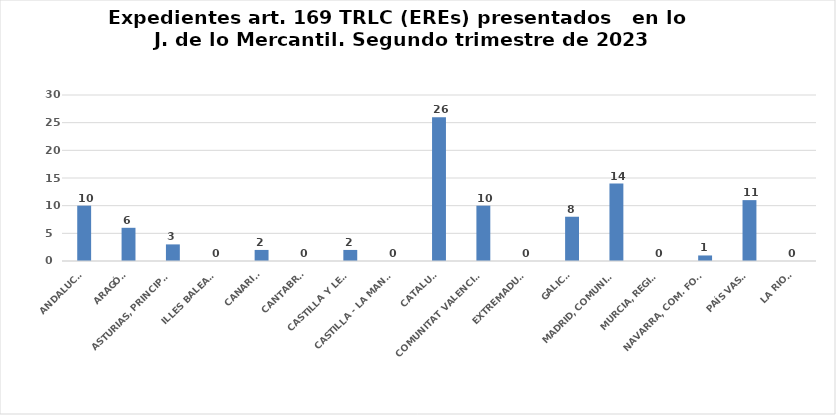
| Category | Series 0 |
|---|---|
| ANDALUCÍA | 10 |
| ARAGÓN | 6 |
| ASTURIAS, PRINCIPADO | 3 |
| ILLES BALEARS | 0 |
| CANARIAS | 2 |
| CANTABRIA | 0 |
| CASTILLA Y LEÓN | 2 |
| CASTILLA - LA MANCHA | 0 |
| CATALUÑA | 26 |
| COMUNITAT VALENCIANA | 10 |
| EXTREMADURA | 0 |
| GALICIA | 8 |
| MADRID, COMUNIDAD | 14 |
| MURCIA, REGIÓN | 0 |
| NAVARRA, COM. FORAL | 1 |
| PAÍS VASCO | 11 |
| LA RIOJA | 0 |